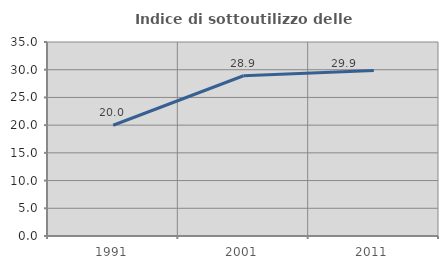
| Category | Indice di sottoutilizzo delle abitazioni  |
|---|---|
| 1991.0 | 19.979 |
| 2001.0 | 28.908 |
| 2011.0 | 29.863 |